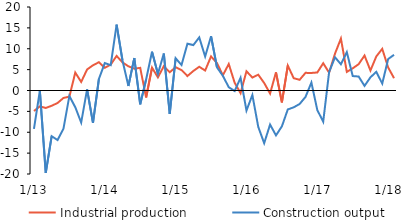
| Category | Industrial production | Construction output |
|---|---|---|
|  1/13 | -4.911 | -9.172 |
| 2 | -3.806 | -0.057 |
| 3 | -4.182 | -19.723 |
| 4 | -3.661 | -10.949 |
| 5 | -2.99 | -11.851 |
| 6 | -1.783 | -9.139 |
| 7 | -1.479 | -1.299 |
| 8 | 4.297 | -3.998 |
| 9 | 2.048 | -7.696 |
| 10 | 5.036 | 0.265 |
| 11 | 6.045 | -7.764 |
| 12 | 6.773 | 2.754 |
|  1/14 | 5.435 | 6.56 |
| 2 | 6.203 | 6.057 |
| 3 | 8.282 | 15.795 |
| 4 | 6.732 | 7.184 |
| 5 | 5.797 | 1.078 |
| 6 | 5.226 | 7.779 |
| 7 | 5.423 | -3.3 |
| 8 | -1.669 | 2.655 |
| 9 | 5.481 | 9.297 |
| 10 | 3.151 | 3.978 |
| 11 | 5.822 | 8.861 |
| 12 | 4.37 | -5.586 |
|  1/15 | 5.578 | 7.726 |
| 2 | 4.89 | 6.1 |
| 3 | 3.468 | 11.217 |
| 4 | 4.673 | 10.879 |
| 5 | 5.689 | 12.707 |
| 6 | 4.783 | 8.158 |
| 7 | 8.163 | 13.013 |
| 8 | 6.583 | 5.557 |
| 9 | 3.645 | 3.514 |
| 10 | 6.344 | 0.785 |
| 11 | 1.856 | -0.13 |
| 12 | -0.637 | 3.053 |
|  1/16 | 4.608 | -4.805 |
| 2 | 3.106 | -1.077 |
| 3 | 3.783 | -8.731 |
| 4 | 1.799 | -12.616 |
| 5 | -0.727 | -8.155 |
| 6 | 4.352 | -10.748 |
| 7 | -2.847 | -8.587 |
| 8 | 5.968 | -4.537 |
| 9 | 2.948 | -4.028 |
| 10 | 2.563 | -3.238 |
| 11 | 4.227 | -1.539 |
| 12 | 4.203 | 1.9 |
|  1/17 | 4.319 | -4.69 |
| 2 | 6.528 | -7.46 |
| 3 | 4.27 | 4.423 |
| 4 | 8.839 | 7.96 |
| 5 | 12.438 | 6.278 |
| 6 | 4.454 | 9.181 |
| 7 | 5.31 | 3.46 |
| 8 | 6.302 | 3.348 |
| 9 | 8.374 | 1.108 |
| 10 | 4.785 | 3.157 |
| 11 | 8.174 | 4.473 |
| 12 | 9.973 | 1.653 |
|  1/18 | 5.52 | 7.524 |
| 2 | 2.95 | 8.558 |